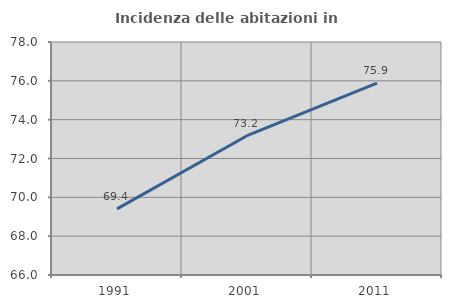
| Category | Incidenza delle abitazioni in proprietà  |
|---|---|
| 1991.0 | 69.404 |
| 2001.0 | 73.174 |
| 2011.0 | 75.881 |